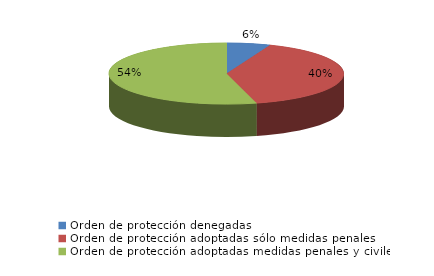
| Category | Series 0 |
|---|---|
| Orden de protección denegadas | 27 |
| Orden de protección adoptadas sólo medidas penales | 180 |
| Orden de protección adoptadas medidas penales y civiles | 244 |